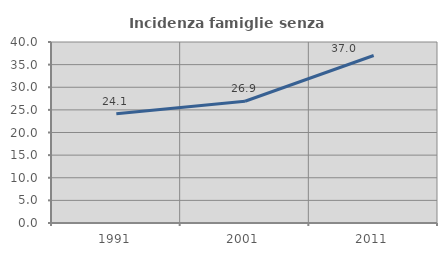
| Category | Incidenza famiglie senza nuclei |
|---|---|
| 1991.0 | 24.123 |
| 2001.0 | 26.914 |
| 2011.0 | 37.013 |